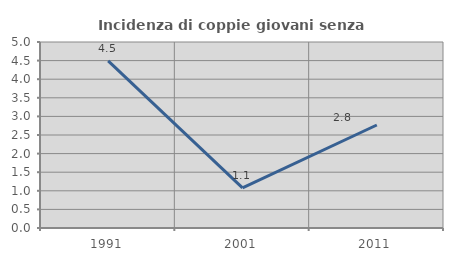
| Category | Incidenza di coppie giovani senza figli |
|---|---|
| 1991.0 | 4.494 |
| 2001.0 | 1.077 |
| 2011.0 | 2.769 |